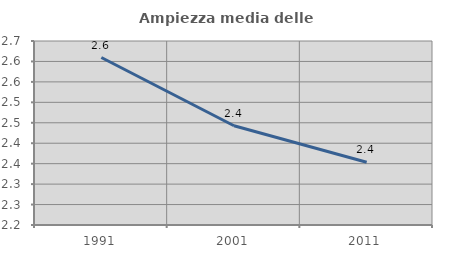
| Category | Ampiezza media delle famiglie |
|---|---|
| 1991.0 | 2.61 |
| 2001.0 | 2.443 |
| 2011.0 | 2.354 |